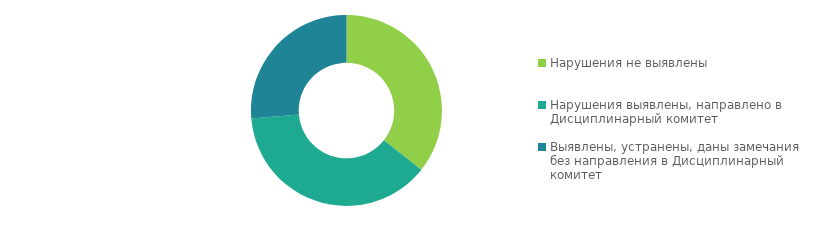
| Category | Series 0 |
|---|---|
| Нарушения не выявлены | 199 |
| Нарушения выявлены, направлено в Дисциплинарный комитет | 212 |
| Выявлены, устранены, даны замечания без направления в Дисциплинарный комитет | 147 |